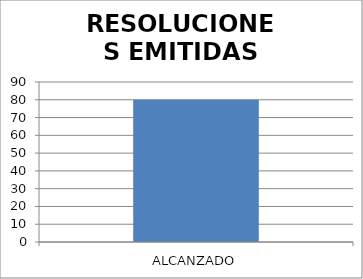
| Category | RESOLUCIONES EMITIDAS DSR |
|---|---|
| ALCANZADO | 80 |